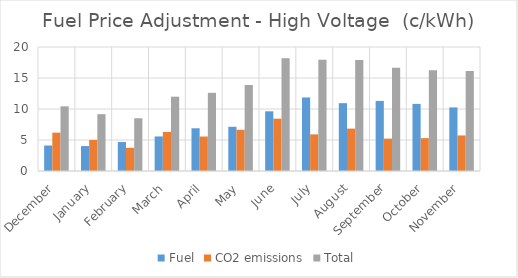
| Category | Fuel | CO2 emissions | Total |
|---|---|---|---|
| December | 4.113 | 6.188 | 10.431 |
| January | 4.02 | 4.996 | 9.163 |
| February | 4.67 | 3.738 | 8.506 |
| March | 5.571 | 6.291 | 11.986 |
| April | 6.89 | 5.562 | 12.606 |
| May | 7.13 | 6.649 | 13.852 |
| June | 9.626 | 8.44 | 18.192 |
| July | 11.861 | 5.91 | 17.936 |
| August | 10.941 | 6.838 | 17.904 |
| September | 11.303 | 5.221 | 16.658 |
| October | 10.824 | 5.298 | 16.264 |
| November | 10.257 | 5.733 | 16.114 |